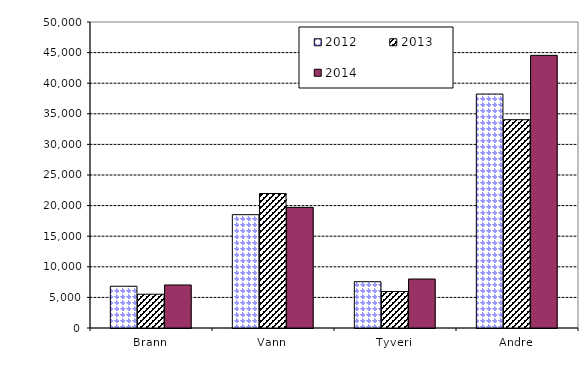
| Category | 2012 | 2013 | 2014 |
|---|---|---|---|
| Brann | 6822.449 | 5520.445 | 7032 |
| Vann | 18517.393 | 21974.572 | 19713 |
| Tyveri | 7564.372 | 5958.397 | 8004 |
| Andre | 38225.991 | 34036.539 | 44550 |